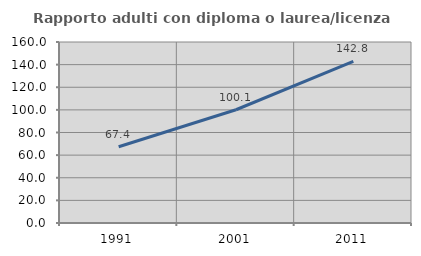
| Category | Rapporto adulti con diploma o laurea/licenza media  |
|---|---|
| 1991.0 | 67.423 |
| 2001.0 | 100.12 |
| 2011.0 | 142.842 |